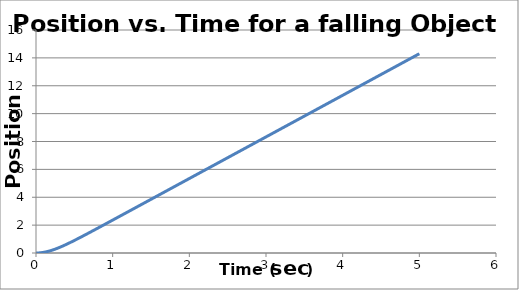
| Category | Series 0 |
|---|---|
| 0.0 | 0 |
| 0.005 | 0 |
| 0.01 | 0 |
| 0.015 | 0.001 |
| 0.02 | 0.002 |
| 0.025 | 0.003 |
| 0.030000000000000002 | 0.004 |
| 0.035 | 0.006 |
| 0.04 | 0.008 |
| 0.045 | 0.01 |
| 0.049999999999999996 | 0.012 |
| 0.05499999999999999 | 0.015 |
| 0.05999999999999999 | 0.018 |
| 0.06499999999999999 | 0.021 |
| 0.06999999999999999 | 0.024 |
| 0.075 | 0.027 |
| 0.08 | 0.031 |
| 0.085 | 0.035 |
| 0.09000000000000001 | 0.039 |
| 0.09500000000000001 | 0.044 |
| 0.10000000000000002 | 0.048 |
| 0.10500000000000002 | 0.053 |
| 0.11000000000000003 | 0.058 |
| 0.11500000000000003 | 0.063 |
| 0.12000000000000004 | 0.069 |
| 0.12500000000000003 | 0.075 |
| 0.13000000000000003 | 0.081 |
| 0.13500000000000004 | 0.087 |
| 0.14000000000000004 | 0.093 |
| 0.14500000000000005 | 0.1 |
| 0.15000000000000005 | 0.106 |
| 0.15500000000000005 | 0.113 |
| 0.16000000000000006 | 0.12 |
| 0.16500000000000006 | 0.128 |
| 0.17000000000000007 | 0.135 |
| 0.17500000000000007 | 0.143 |
| 0.18000000000000008 | 0.151 |
| 0.18500000000000008 | 0.159 |
| 0.19000000000000009 | 0.167 |
| 0.1950000000000001 | 0.175 |
| 0.2000000000000001 | 0.184 |
| 0.2050000000000001 | 0.193 |
| 0.2100000000000001 | 0.201 |
| 0.2150000000000001 | 0.21 |
| 0.2200000000000001 | 0.22 |
| 0.22500000000000012 | 0.229 |
| 0.23000000000000012 | 0.239 |
| 0.23500000000000013 | 0.248 |
| 0.24000000000000013 | 0.258 |
| 0.24500000000000013 | 0.268 |
| 0.2500000000000001 | 0.278 |
| 0.2550000000000001 | 0.288 |
| 0.2600000000000001 | 0.298 |
| 0.2650000000000001 | 0.309 |
| 0.27000000000000013 | 0.319 |
| 0.27500000000000013 | 0.33 |
| 0.28000000000000014 | 0.341 |
| 0.28500000000000014 | 0.352 |
| 0.29000000000000015 | 0.363 |
| 0.29500000000000015 | 0.374 |
| 0.30000000000000016 | 0.385 |
| 0.30500000000000016 | 0.397 |
| 0.31000000000000016 | 0.408 |
| 0.31500000000000017 | 0.42 |
| 0.3200000000000002 | 0.431 |
| 0.3250000000000002 | 0.443 |
| 0.3300000000000002 | 0.455 |
| 0.3350000000000002 | 0.467 |
| 0.3400000000000002 | 0.479 |
| 0.3450000000000002 | 0.491 |
| 0.3500000000000002 | 0.503 |
| 0.3550000000000002 | 0.516 |
| 0.3600000000000002 | 0.528 |
| 0.3650000000000002 | 0.54 |
| 0.3700000000000002 | 0.553 |
| 0.3750000000000002 | 0.566 |
| 0.3800000000000002 | 0.578 |
| 0.38500000000000023 | 0.591 |
| 0.39000000000000024 | 0.604 |
| 0.39500000000000024 | 0.617 |
| 0.40000000000000024 | 0.629 |
| 0.40500000000000025 | 0.642 |
| 0.41000000000000025 | 0.656 |
| 0.41500000000000026 | 0.669 |
| 0.42000000000000026 | 0.682 |
| 0.42500000000000027 | 0.695 |
| 0.43000000000000027 | 0.708 |
| 0.4350000000000003 | 0.722 |
| 0.4400000000000003 | 0.735 |
| 0.4450000000000003 | 0.748 |
| 0.4500000000000003 | 0.762 |
| 0.4550000000000003 | 0.775 |
| 0.4600000000000003 | 0.789 |
| 0.4650000000000003 | 0.802 |
| 0.4700000000000003 | 0.816 |
| 0.4750000000000003 | 0.83 |
| 0.4800000000000003 | 0.843 |
| 0.4850000000000003 | 0.857 |
| 0.4900000000000003 | 0.871 |
| 0.49500000000000033 | 0.885 |
| 0.5000000000000003 | 0.899 |
| 0.5050000000000003 | 0.913 |
| 0.5100000000000003 | 0.927 |
| 0.5150000000000003 | 0.941 |
| 0.5200000000000004 | 0.954 |
| 0.5250000000000004 | 0.969 |
| 0.5300000000000004 | 0.983 |
| 0.5350000000000004 | 0.997 |
| 0.5400000000000004 | 1.011 |
| 0.5450000000000004 | 1.025 |
| 0.5500000000000004 | 1.039 |
| 0.5550000000000004 | 1.053 |
| 0.5600000000000004 | 1.067 |
| 0.5650000000000004 | 1.082 |
| 0.5700000000000004 | 1.096 |
| 0.5750000000000004 | 1.11 |
| 0.5800000000000004 | 1.124 |
| 0.5850000000000004 | 1.139 |
| 0.5900000000000004 | 1.153 |
| 0.5950000000000004 | 1.167 |
| 0.6000000000000004 | 1.182 |
| 0.6050000000000004 | 1.196 |
| 0.6100000000000004 | 1.211 |
| 0.6150000000000004 | 1.225 |
| 0.6200000000000004 | 1.239 |
| 0.6250000000000004 | 1.254 |
| 0.6300000000000004 | 1.268 |
| 0.6350000000000005 | 1.283 |
| 0.6400000000000005 | 1.297 |
| 0.6450000000000005 | 1.312 |
| 0.6500000000000005 | 1.326 |
| 0.6550000000000005 | 1.341 |
| 0.6600000000000005 | 1.355 |
| 0.6650000000000005 | 1.37 |
| 0.6700000000000005 | 1.385 |
| 0.6750000000000005 | 1.399 |
| 0.6800000000000005 | 1.414 |
| 0.6850000000000005 | 1.428 |
| 0.6900000000000005 | 1.443 |
| 0.6950000000000005 | 1.458 |
| 0.7000000000000005 | 1.472 |
| 0.7050000000000005 | 1.487 |
| 0.7100000000000005 | 1.502 |
| 0.7150000000000005 | 1.516 |
| 0.7200000000000005 | 1.531 |
| 0.7250000000000005 | 1.546 |
| 0.7300000000000005 | 1.56 |
| 0.7350000000000005 | 1.575 |
| 0.7400000000000005 | 1.59 |
| 0.7450000000000006 | 1.604 |
| 0.7500000000000006 | 1.619 |
| 0.7550000000000006 | 1.634 |
| 0.7600000000000006 | 1.649 |
| 0.7650000000000006 | 1.663 |
| 0.7700000000000006 | 1.678 |
| 0.7750000000000006 | 1.693 |
| 0.7800000000000006 | 1.708 |
| 0.7850000000000006 | 1.722 |
| 0.7900000000000006 | 1.737 |
| 0.7950000000000006 | 1.752 |
| 0.8000000000000006 | 1.767 |
| 0.8050000000000006 | 1.781 |
| 0.8100000000000006 | 1.796 |
| 0.8150000000000006 | 1.811 |
| 0.8200000000000006 | 1.826 |
| 0.8250000000000006 | 1.841 |
| 0.8300000000000006 | 1.855 |
| 0.8350000000000006 | 1.87 |
| 0.8400000000000006 | 1.885 |
| 0.8450000000000006 | 1.9 |
| 0.8500000000000006 | 1.915 |
| 0.8550000000000006 | 1.929 |
| 0.8600000000000007 | 1.944 |
| 0.8650000000000007 | 1.959 |
| 0.8700000000000007 | 1.974 |
| 0.8750000000000007 | 1.989 |
| 0.8800000000000007 | 2.004 |
| 0.8850000000000007 | 2.018 |
| 0.8900000000000007 | 2.033 |
| 0.8950000000000007 | 2.048 |
| 0.9000000000000007 | 2.063 |
| 0.9050000000000007 | 2.078 |
| 0.9100000000000007 | 2.093 |
| 0.9150000000000007 | 2.108 |
| 0.9200000000000007 | 2.122 |
| 0.9250000000000007 | 2.137 |
| 0.9300000000000007 | 2.152 |
| 0.9350000000000007 | 2.167 |
| 0.9400000000000007 | 2.182 |
| 0.9450000000000007 | 2.197 |
| 0.9500000000000007 | 2.212 |
| 0.9550000000000007 | 2.226 |
| 0.9600000000000007 | 2.241 |
| 0.9650000000000007 | 2.256 |
| 0.9700000000000008 | 2.271 |
| 0.9750000000000008 | 2.286 |
| 0.9800000000000008 | 2.301 |
| 0.9850000000000008 | 2.316 |
| 0.9900000000000008 | 2.331 |
| 0.9950000000000008 | 2.345 |
| 1.0000000000000007 | 2.36 |
| 1.0050000000000006 | 2.375 |
| 1.0100000000000005 | 2.39 |
| 1.0150000000000003 | 2.405 |
| 1.0200000000000002 | 2.42 |
| 1.0250000000000001 | 2.435 |
| 1.03 | 2.45 |
| 1.035 | 2.465 |
| 1.0399999999999998 | 2.48 |
| 1.0449999999999997 | 2.494 |
| 1.0499999999999996 | 2.509 |
| 1.0549999999999995 | 2.524 |
| 1.0599999999999994 | 2.539 |
| 1.0649999999999993 | 2.554 |
| 1.0699999999999992 | 2.569 |
| 1.074999999999999 | 2.584 |
| 1.079999999999999 | 2.599 |
| 1.0849999999999989 | 2.614 |
| 1.0899999999999987 | 2.628 |
| 1.0949999999999986 | 2.643 |
| 1.0999999999999985 | 2.658 |
| 1.1049999999999984 | 2.673 |
| 1.1099999999999983 | 2.688 |
| 1.1149999999999982 | 2.703 |
| 1.119999999999998 | 2.718 |
| 1.124999999999998 | 2.733 |
| 1.129999999999998 | 2.748 |
| 1.1349999999999978 | 2.763 |
| 1.1399999999999977 | 2.778 |
| 1.1449999999999976 | 2.792 |
| 1.1499999999999975 | 2.807 |
| 1.1549999999999974 | 2.822 |
| 1.1599999999999973 | 2.837 |
| 1.1649999999999971 | 2.852 |
| 1.169999999999997 | 2.867 |
| 1.174999999999997 | 2.882 |
| 1.1799999999999968 | 2.897 |
| 1.1849999999999967 | 2.912 |
| 1.1899999999999966 | 2.927 |
| 1.1949999999999965 | 2.942 |
| 1.1999999999999964 | 2.956 |
| 1.2049999999999963 | 2.971 |
| 1.2099999999999962 | 2.986 |
| 1.214999999999996 | 3.001 |
| 1.219999999999996 | 3.016 |
| 1.2249999999999959 | 3.031 |
| 1.2299999999999958 | 3.046 |
| 1.2349999999999957 | 3.061 |
| 1.2399999999999956 | 3.076 |
| 1.2449999999999954 | 3.091 |
| 1.2499999999999953 | 3.106 |
| 1.2549999999999952 | 3.121 |
| 1.2599999999999951 | 3.135 |
| 1.264999999999995 | 3.15 |
| 1.269999999999995 | 3.165 |
| 1.2749999999999948 | 3.18 |
| 1.2799999999999947 | 3.195 |
| 1.2849999999999946 | 3.21 |
| 1.2899999999999945 | 3.225 |
| 1.2949999999999944 | 3.24 |
| 1.2999999999999943 | 3.255 |
| 1.3049999999999942 | 3.27 |
| 1.309999999999994 | 3.285 |
| 1.314999999999994 | 3.3 |
| 1.3199999999999938 | 3.315 |
| 1.3249999999999937 | 3.329 |
| 1.3299999999999936 | 3.344 |
| 1.3349999999999935 | 3.359 |
| 1.3399999999999934 | 3.374 |
| 1.3449999999999933 | 3.389 |
| 1.3499999999999932 | 3.404 |
| 1.354999999999993 | 3.419 |
| 1.359999999999993 | 3.434 |
| 1.3649999999999929 | 3.449 |
| 1.3699999999999928 | 3.464 |
| 1.3749999999999927 | 3.479 |
| 1.3799999999999926 | 3.494 |
| 1.3849999999999925 | 3.508 |
| 1.3899999999999924 | 3.523 |
| 1.3949999999999922 | 3.538 |
| 1.3999999999999921 | 3.553 |
| 1.404999999999992 | 3.568 |
| 1.409999999999992 | 3.583 |
| 1.4149999999999918 | 3.598 |
| 1.4199999999999917 | 3.613 |
| 1.4249999999999916 | 3.628 |
| 1.4299999999999915 | 3.643 |
| 1.4349999999999914 | 3.658 |
| 1.4399999999999913 | 3.673 |
| 1.4449999999999912 | 3.688 |
| 1.449999999999991 | 3.702 |
| 1.454999999999991 | 3.717 |
| 1.4599999999999909 | 3.732 |
| 1.4649999999999908 | 3.747 |
| 1.4699999999999906 | 3.762 |
| 1.4749999999999905 | 3.777 |
| 1.4799999999999904 | 3.792 |
| 1.4849999999999903 | 3.807 |
| 1.4899999999999902 | 3.822 |
| 1.4949999999999901 | 3.837 |
| 1.49999999999999 | 3.852 |
| 1.50499999999999 | 3.867 |
| 1.5099999999999898 | 3.882 |
| 1.5149999999999897 | 3.896 |
| 1.5199999999999896 | 3.911 |
| 1.5249999999999895 | 3.926 |
| 1.5299999999999894 | 3.941 |
| 1.5349999999999893 | 3.956 |
| 1.5399999999999892 | 3.971 |
| 1.544999999999989 | 3.986 |
| 1.549999999999989 | 4.001 |
| 1.5549999999999888 | 4.016 |
| 1.5599999999999887 | 4.031 |
| 1.5649999999999886 | 4.046 |
| 1.5699999999999885 | 4.061 |
| 1.5749999999999884 | 4.076 |
| 1.5799999999999883 | 4.09 |
| 1.5849999999999882 | 4.105 |
| 1.589999999999988 | 4.12 |
| 1.594999999999988 | 4.135 |
| 1.5999999999999879 | 4.15 |
| 1.6049999999999878 | 4.165 |
| 1.6099999999999877 | 4.18 |
| 1.6149999999999876 | 4.195 |
| 1.6199999999999875 | 4.21 |
| 1.6249999999999873 | 4.225 |
| 1.6299999999999872 | 4.24 |
| 1.6349999999999871 | 4.255 |
| 1.639999999999987 | 4.27 |
| 1.644999999999987 | 4.284 |
| 1.6499999999999868 | 4.299 |
| 1.6549999999999867 | 4.314 |
| 1.6599999999999866 | 4.329 |
| 1.6649999999999865 | 4.344 |
| 1.6699999999999864 | 4.359 |
| 1.6749999999999863 | 4.374 |
| 1.6799999999999862 | 4.389 |
| 1.684999999999986 | 4.404 |
| 1.689999999999986 | 4.419 |
| 1.6949999999999859 | 4.434 |
| 1.6999999999999857 | 4.449 |
| 1.7049999999999856 | 4.464 |
| 1.7099999999999855 | 4.478 |
| 1.7149999999999854 | 4.493 |
| 1.7199999999999853 | 4.508 |
| 1.7249999999999852 | 4.523 |
| 1.729999999999985 | 4.538 |
| 1.734999999999985 | 4.553 |
| 1.739999999999985 | 4.568 |
| 1.7449999999999848 | 4.583 |
| 1.7499999999999847 | 4.598 |
| 1.7549999999999846 | 4.613 |
| 1.7599999999999845 | 4.628 |
| 1.7649999999999844 | 4.643 |
| 1.7699999999999843 | 4.658 |
| 1.7749999999999841 | 4.672 |
| 1.779999999999984 | 4.687 |
| 1.784999999999984 | 4.702 |
| 1.7899999999999838 | 4.717 |
| 1.7949999999999837 | 4.732 |
| 1.7999999999999836 | 4.747 |
| 1.8049999999999835 | 4.762 |
| 1.8099999999999834 | 4.777 |
| 1.8149999999999833 | 4.792 |
| 1.8199999999999832 | 4.807 |
| 1.824999999999983 | 4.822 |
| 1.829999999999983 | 4.837 |
| 1.8349999999999829 | 4.852 |
| 1.8399999999999828 | 4.866 |
| 1.8449999999999827 | 4.881 |
| 1.8499999999999825 | 4.896 |
| 1.8549999999999824 | 4.911 |
| 1.8599999999999823 | 4.926 |
| 1.8649999999999822 | 4.941 |
| 1.8699999999999821 | 4.956 |
| 1.874999999999982 | 4.971 |
| 1.879999999999982 | 4.986 |
| 1.8849999999999818 | 5.001 |
| 1.8899999999999817 | 5.016 |
| 1.8949999999999816 | 5.031 |
| 1.8999999999999815 | 5.046 |
| 1.9049999999999814 | 5.06 |
| 1.9099999999999813 | 5.075 |
| 1.9149999999999812 | 5.09 |
| 1.919999999999981 | 5.105 |
| 1.924999999999981 | 5.12 |
| 1.9299999999999808 | 5.135 |
| 1.9349999999999807 | 5.15 |
| 1.9399999999999806 | 5.165 |
| 1.9449999999999805 | 5.18 |
| 1.9499999999999804 | 5.195 |
| 1.9549999999999803 | 5.21 |
| 1.9599999999999802 | 5.225 |
| 1.96499999999998 | 5.24 |
| 1.96999999999998 | 5.254 |
| 1.9749999999999799 | 5.269 |
| 1.9799999999999798 | 5.284 |
| 1.9849999999999797 | 5.299 |
| 1.9899999999999796 | 5.314 |
| 1.9949999999999795 | 5.329 |
| 1.9999999999999793 | 5.344 |
| 2.0049999999999795 | 5.359 |
| 2.0099999999999794 | 5.374 |
| 2.0149999999999793 | 5.389 |
| 2.019999999999979 | 5.404 |
| 2.024999999999979 | 5.419 |
| 2.029999999999979 | 5.434 |
| 2.034999999999979 | 5.449 |
| 2.0399999999999787 | 5.463 |
| 2.0449999999999786 | 5.478 |
| 2.0499999999999785 | 5.493 |
| 2.0549999999999784 | 5.508 |
| 2.0599999999999783 | 5.523 |
| 2.064999999999978 | 5.538 |
| 2.069999999999978 | 5.553 |
| 2.074999999999978 | 5.568 |
| 2.079999999999978 | 5.583 |
| 2.0849999999999778 | 5.598 |
| 2.0899999999999777 | 5.613 |
| 2.0949999999999775 | 5.628 |
| 2.0999999999999774 | 5.643 |
| 2.1049999999999773 | 5.657 |
| 2.1099999999999772 | 5.672 |
| 2.114999999999977 | 5.687 |
| 2.119999999999977 | 5.702 |
| 2.124999999999977 | 5.717 |
| 2.129999999999977 | 5.732 |
| 2.1349999999999767 | 5.747 |
| 2.1399999999999766 | 5.762 |
| 2.1449999999999765 | 5.777 |
| 2.1499999999999764 | 5.792 |
| 2.1549999999999763 | 5.807 |
| 2.159999999999976 | 5.822 |
| 2.164999999999976 | 5.837 |
| 2.169999999999976 | 5.851 |
| 2.174999999999976 | 5.866 |
| 2.1799999999999757 | 5.881 |
| 2.1849999999999756 | 5.896 |
| 2.1899999999999755 | 5.911 |
| 2.1949999999999754 | 5.926 |
| 2.1999999999999753 | 5.941 |
| 2.204999999999975 | 5.956 |
| 2.209999999999975 | 5.971 |
| 2.214999999999975 | 5.986 |
| 2.219999999999975 | 6.001 |
| 2.2249999999999748 | 6.016 |
| 2.2299999999999747 | 6.031 |
| 2.2349999999999746 | 6.045 |
| 2.2399999999999745 | 6.06 |
| 2.2449999999999743 | 6.075 |
| 2.2499999999999742 | 6.09 |
| 2.254999999999974 | 6.105 |
| 2.259999999999974 | 6.12 |
| 2.264999999999974 | 6.135 |
| 2.269999999999974 | 6.15 |
| 2.2749999999999737 | 6.165 |
| 2.2799999999999736 | 6.18 |
| 2.2849999999999735 | 6.195 |
| 2.2899999999999734 | 6.21 |
| 2.2949999999999733 | 6.225 |
| 2.299999999999973 | 6.239 |
| 2.304999999999973 | 6.254 |
| 2.309999999999973 | 6.269 |
| 2.314999999999973 | 6.284 |
| 2.3199999999999728 | 6.299 |
| 2.3249999999999726 | 6.314 |
| 2.3299999999999725 | 6.329 |
| 2.3349999999999724 | 6.344 |
| 2.3399999999999723 | 6.359 |
| 2.344999999999972 | 6.374 |
| 2.349999999999972 | 6.389 |
| 2.354999999999972 | 6.404 |
| 2.359999999999972 | 6.419 |
| 2.364999999999972 | 6.433 |
| 2.3699999999999717 | 6.448 |
| 2.3749999999999716 | 6.463 |
| 2.3799999999999715 | 6.478 |
| 2.3849999999999714 | 6.493 |
| 2.3899999999999713 | 6.508 |
| 2.394999999999971 | 6.523 |
| 2.399999999999971 | 6.538 |
| 2.404999999999971 | 6.553 |
| 2.409999999999971 | 6.568 |
| 2.4149999999999707 | 6.583 |
| 2.4199999999999706 | 6.598 |
| 2.4249999999999705 | 6.613 |
| 2.4299999999999704 | 6.628 |
| 2.4349999999999703 | 6.642 |
| 2.43999999999997 | 6.657 |
| 2.44499999999997 | 6.672 |
| 2.44999999999997 | 6.687 |
| 2.45499999999997 | 6.702 |
| 2.4599999999999698 | 6.717 |
| 2.4649999999999697 | 6.732 |
| 2.4699999999999696 | 6.747 |
| 2.4749999999999694 | 6.762 |
| 2.4799999999999693 | 6.777 |
| 2.4849999999999692 | 6.792 |
| 2.489999999999969 | 6.807 |
| 2.494999999999969 | 6.822 |
| 2.499999999999969 | 6.836 |
| 2.504999999999969 | 6.851 |
| 2.5099999999999687 | 6.866 |
| 2.5149999999999686 | 6.881 |
| 2.5199999999999685 | 6.896 |
| 2.5249999999999684 | 6.911 |
| 2.5299999999999683 | 6.926 |
| 2.534999999999968 | 6.941 |
| 2.539999999999968 | 6.956 |
| 2.544999999999968 | 6.971 |
| 2.549999999999968 | 6.986 |
| 2.5549999999999677 | 7.001 |
| 2.5599999999999676 | 7.016 |
| 2.5649999999999675 | 7.03 |
| 2.5699999999999674 | 7.045 |
| 2.5749999999999673 | 7.06 |
| 2.579999999999967 | 7.075 |
| 2.584999999999967 | 7.09 |
| 2.589999999999967 | 7.105 |
| 2.594999999999967 | 7.12 |
| 2.599999999999967 | 7.135 |
| 2.6049999999999667 | 7.15 |
| 2.6099999999999666 | 7.165 |
| 2.6149999999999665 | 7.18 |
| 2.6199999999999664 | 7.195 |
| 2.6249999999999662 | 7.21 |
| 2.629999999999966 | 7.224 |
| 2.634999999999966 | 7.239 |
| 2.639999999999966 | 7.254 |
| 2.644999999999966 | 7.269 |
| 2.6499999999999657 | 7.284 |
| 2.6549999999999656 | 7.299 |
| 2.6599999999999655 | 7.314 |
| 2.6649999999999654 | 7.329 |
| 2.6699999999999653 | 7.344 |
| 2.674999999999965 | 7.359 |
| 2.679999999999965 | 7.374 |
| 2.684999999999965 | 7.389 |
| 2.689999999999965 | 7.404 |
| 2.6949999999999648 | 7.418 |
| 2.6999999999999647 | 7.433 |
| 2.7049999999999645 | 7.448 |
| 2.7099999999999644 | 7.463 |
| 2.7149999999999643 | 7.478 |
| 2.7199999999999642 | 7.493 |
| 2.724999999999964 | 7.508 |
| 2.729999999999964 | 7.523 |
| 2.734999999999964 | 7.538 |
| 2.739999999999964 | 7.553 |
| 2.7449999999999637 | 7.568 |
| 2.7499999999999636 | 7.583 |
| 2.7549999999999635 | 7.598 |
| 2.7599999999999634 | 7.612 |
| 2.7649999999999633 | 7.627 |
| 2.769999999999963 | 7.642 |
| 2.774999999999963 | 7.657 |
| 2.779999999999963 | 7.672 |
| 2.784999999999963 | 7.687 |
| 2.7899999999999627 | 7.702 |
| 2.7949999999999626 | 7.717 |
| 2.7999999999999625 | 7.732 |
| 2.8049999999999624 | 7.747 |
| 2.8099999999999623 | 7.762 |
| 2.814999999999962 | 7.777 |
| 2.819999999999962 | 7.792 |
| 2.824999999999962 | 7.807 |
| 2.829999999999962 | 7.821 |
| 2.8349999999999618 | 7.836 |
| 2.8399999999999617 | 7.851 |
| 2.8449999999999616 | 7.866 |
| 2.8499999999999615 | 7.881 |
| 2.8549999999999613 | 7.896 |
| 2.8599999999999612 | 7.911 |
| 2.864999999999961 | 7.926 |
| 2.869999999999961 | 7.941 |
| 2.874999999999961 | 7.956 |
| 2.879999999999961 | 7.971 |
| 2.8849999999999607 | 7.986 |
| 2.8899999999999606 | 8.001 |
| 2.8949999999999605 | 8.015 |
| 2.8999999999999604 | 8.03 |
| 2.9049999999999603 | 8.045 |
| 2.90999999999996 | 8.06 |
| 2.91499999999996 | 8.075 |
| 2.91999999999996 | 8.09 |
| 2.92499999999996 | 8.105 |
| 2.9299999999999597 | 8.12 |
| 2.9349999999999596 | 8.135 |
| 2.9399999999999595 | 8.15 |
| 2.9449999999999594 | 8.165 |
| 2.9499999999999593 | 8.18 |
| 2.954999999999959 | 8.195 |
| 2.959999999999959 | 8.209 |
| 2.964999999999959 | 8.224 |
| 2.969999999999959 | 8.239 |
| 2.974999999999959 | 8.254 |
| 2.9799999999999587 | 8.269 |
| 2.9849999999999586 | 8.284 |
| 2.9899999999999585 | 8.299 |
| 2.9949999999999584 | 8.314 |
| 2.9999999999999583 | 8.329 |
| 3.004999999999958 | 8.344 |
| 3.009999999999958 | 8.359 |
| 3.014999999999958 | 8.374 |
| 3.019999999999958 | 8.389 |
| 3.0249999999999577 | 8.403 |
| 3.0299999999999576 | 8.418 |
| 3.0349999999999575 | 8.433 |
| 3.0399999999999574 | 8.448 |
| 3.0449999999999573 | 8.463 |
| 3.049999999999957 | 8.478 |
| 3.054999999999957 | 8.493 |
| 3.059999999999957 | 8.508 |
| 3.064999999999957 | 8.523 |
| 3.0699999999999568 | 8.538 |
| 3.0749999999999567 | 8.553 |
| 3.0799999999999566 | 8.568 |
| 3.0849999999999564 | 8.583 |
| 3.0899999999999563 | 8.597 |
| 3.0949999999999562 | 8.612 |
| 3.099999999999956 | 8.627 |
| 3.104999999999956 | 8.642 |
| 3.109999999999956 | 8.657 |
| 3.114999999999956 | 8.672 |
| 3.1199999999999557 | 8.687 |
| 3.1249999999999556 | 8.702 |
| 3.1299999999999555 | 8.717 |
| 3.1349999999999554 | 8.732 |
| 3.1399999999999553 | 8.747 |
| 3.144999999999955 | 8.762 |
| 3.149999999999955 | 8.777 |
| 3.154999999999955 | 8.791 |
| 3.159999999999955 | 8.806 |
| 3.1649999999999547 | 8.821 |
| 3.1699999999999546 | 8.836 |
| 3.1749999999999545 | 8.851 |
| 3.1799999999999544 | 8.866 |
| 3.1849999999999543 | 8.881 |
| 3.189999999999954 | 8.896 |
| 3.194999999999954 | 8.911 |
| 3.199999999999954 | 8.926 |
| 3.204999999999954 | 8.941 |
| 3.209999999999954 | 8.956 |
| 3.2149999999999537 | 8.971 |
| 3.2199999999999536 | 8.986 |
| 3.2249999999999535 | 9 |
| 3.2299999999999534 | 9.015 |
| 3.2349999999999532 | 9.03 |
| 3.239999999999953 | 9.045 |
| 3.244999999999953 | 9.06 |
| 3.249999999999953 | 9.075 |
| 3.254999999999953 | 9.09 |
| 3.2599999999999527 | 9.105 |
| 3.2649999999999526 | 9.12 |
| 3.2699999999999525 | 9.135 |
| 3.2749999999999524 | 9.15 |
| 3.2799999999999523 | 9.165 |
| 3.284999999999952 | 9.18 |
| 3.289999999999952 | 9.194 |
| 3.294999999999952 | 9.209 |
| 3.299999999999952 | 9.224 |
| 3.3049999999999518 | 9.239 |
| 3.3099999999999516 | 9.254 |
| 3.3149999999999515 | 9.269 |
| 3.3199999999999514 | 9.284 |
| 3.3249999999999513 | 9.299 |
| 3.329999999999951 | 9.314 |
| 3.334999999999951 | 9.329 |
| 3.339999999999951 | 9.344 |
| 3.344999999999951 | 9.359 |
| 3.349999999999951 | 9.374 |
| 3.3549999999999507 | 9.388 |
| 3.3599999999999506 | 9.403 |
| 3.3649999999999505 | 9.418 |
| 3.3699999999999504 | 9.433 |
| 3.3749999999999503 | 9.448 |
| 3.37999999999995 | 9.463 |
| 3.38499999999995 | 9.478 |
| 3.38999999999995 | 9.493 |
| 3.39499999999995 | 9.508 |
| 3.3999999999999497 | 9.523 |
| 3.4049999999999496 | 9.538 |
| 3.4099999999999495 | 9.553 |
| 3.4149999999999494 | 9.568 |
| 3.4199999999999493 | 9.582 |
| 3.424999999999949 | 9.597 |
| 3.429999999999949 | 9.612 |
| 3.434999999999949 | 9.627 |
| 3.439999999999949 | 9.642 |
| 3.4449999999999488 | 9.657 |
| 3.4499999999999487 | 9.672 |
| 3.4549999999999486 | 9.687 |
| 3.4599999999999485 | 9.702 |
| 3.4649999999999483 | 9.717 |
| 3.4699999999999482 | 9.732 |
| 3.474999999999948 | 9.747 |
| 3.479999999999948 | 9.762 |
| 3.484999999999948 | 9.776 |
| 3.489999999999948 | 9.791 |
| 3.4949999999999477 | 9.806 |
| 3.4999999999999476 | 9.821 |
| 3.5049999999999475 | 9.836 |
| 3.5099999999999474 | 9.851 |
| 3.5149999999999473 | 9.866 |
| 3.519999999999947 | 9.881 |
| 3.524999999999947 | 9.896 |
| 3.529999999999947 | 9.911 |
| 3.534999999999947 | 9.926 |
| 3.5399999999999467 | 9.941 |
| 3.5449999999999466 | 9.956 |
| 3.5499999999999465 | 9.97 |
| 3.5549999999999464 | 9.985 |
| 3.5599999999999463 | 10 |
| 3.564999999999946 | 10.015 |
| 3.569999999999946 | 10.03 |
| 3.574999999999946 | 10.045 |
| 3.579999999999946 | 10.06 |
| 3.584999999999946 | 10.075 |
| 3.5899999999999457 | 10.09 |
| 3.5949999999999456 | 10.105 |
| 3.5999999999999455 | 10.12 |
| 3.6049999999999454 | 10.135 |
| 3.6099999999999453 | 10.15 |
| 3.614999999999945 | 10.165 |
| 3.619999999999945 | 10.179 |
| 3.624999999999945 | 10.194 |
| 3.629999999999945 | 10.209 |
| 3.6349999999999447 | 10.224 |
| 3.6399999999999446 | 10.239 |
| 3.6449999999999445 | 10.254 |
| 3.6499999999999444 | 10.269 |
| 3.6549999999999443 | 10.284 |
| 3.659999999999944 | 10.299 |
| 3.664999999999944 | 10.314 |
| 3.669999999999944 | 10.329 |
| 3.674999999999944 | 10.344 |
| 3.6799999999999438 | 10.359 |
| 3.6849999999999437 | 10.373 |
| 3.6899999999999435 | 10.388 |
| 3.6949999999999434 | 10.403 |
| 3.6999999999999433 | 10.418 |
| 3.7049999999999432 | 10.433 |
| 3.709999999999943 | 10.448 |
| 3.714999999999943 | 10.463 |
| 3.719999999999943 | 10.478 |
| 3.724999999999943 | 10.493 |
| 3.7299999999999427 | 10.508 |
| 3.7349999999999426 | 10.523 |
| 3.7399999999999425 | 10.538 |
| 3.7449999999999424 | 10.553 |
| 3.7499999999999423 | 10.567 |
| 3.754999999999942 | 10.582 |
| 3.759999999999942 | 10.597 |
| 3.764999999999942 | 10.612 |
| 3.769999999999942 | 10.627 |
| 3.7749999999999417 | 10.642 |
| 3.7799999999999416 | 10.657 |
| 3.7849999999999415 | 10.672 |
| 3.7899999999999414 | 10.687 |
| 3.7949999999999413 | 10.702 |
| 3.799999999999941 | 10.717 |
| 3.804999999999941 | 10.732 |
| 3.809999999999941 | 10.747 |
| 3.814999999999941 | 10.761 |
| 3.8199999999999408 | 10.776 |
| 3.8249999999999407 | 10.791 |
| 3.8299999999999406 | 10.806 |
| 3.8349999999999405 | 10.821 |
| 3.8399999999999403 | 10.836 |
| 3.8449999999999402 | 10.851 |
| 3.84999999999994 | 10.866 |
| 3.85499999999994 | 10.881 |
| 3.85999999999994 | 10.896 |
| 3.86499999999994 | 10.911 |
| 3.8699999999999397 | 10.926 |
| 3.8749999999999396 | 10.941 |
| 3.8799999999999395 | 10.955 |
| 3.8849999999999394 | 10.97 |
| 3.8899999999999393 | 10.985 |
| 3.894999999999939 | 11 |
| 3.899999999999939 | 11.015 |
| 3.904999999999939 | 11.03 |
| 3.909999999999939 | 11.045 |
| 3.9149999999999388 | 11.06 |
| 3.9199999999999386 | 11.075 |
| 3.9249999999999385 | 11.09 |
| 3.9299999999999384 | 11.105 |
| 3.9349999999999383 | 11.12 |
| 3.939999999999938 | 11.135 |
| 3.944999999999938 | 11.149 |
| 3.949999999999938 | 11.164 |
| 3.954999999999938 | 11.179 |
| 3.959999999999938 | 11.194 |
| 3.9649999999999377 | 11.209 |
| 3.9699999999999376 | 11.224 |
| 3.9749999999999375 | 11.239 |
| 3.9799999999999374 | 11.254 |
| 3.9849999999999373 | 11.269 |
| 3.989999999999937 | 11.284 |
| 3.994999999999937 | 11.299 |
| 3.999999999999937 | 11.314 |
| 4.004999999999937 | 11.329 |
| 4.009999999999937 | 11.344 |
| 4.014999999999937 | 11.358 |
| 4.0199999999999365 | 11.373 |
| 4.024999999999936 | 11.388 |
| 4.029999999999936 | 11.403 |
| 4.034999999999936 | 11.418 |
| 4.039999999999936 | 11.433 |
| 4.044999999999936 | 11.448 |
| 4.049999999999936 | 11.463 |
| 4.054999999999936 | 11.478 |
| 4.059999999999936 | 11.493 |
| 4.0649999999999356 | 11.508 |
| 4.0699999999999354 | 11.523 |
| 4.074999999999935 | 11.538 |
| 4.079999999999935 | 11.552 |
| 4.084999999999935 | 11.567 |
| 4.089999999999935 | 11.582 |
| 4.094999999999935 | 11.597 |
| 4.099999999999935 | 11.612 |
| 4.104999999999935 | 11.627 |
| 4.109999999999935 | 11.642 |
| 4.1149999999999345 | 11.657 |
| 4.119999999999934 | 11.672 |
| 4.124999999999934 | 11.687 |
| 4.129999999999934 | 11.702 |
| 4.134999999999934 | 11.717 |
| 4.139999999999934 | 11.732 |
| 4.144999999999934 | 11.746 |
| 4.149999999999934 | 11.761 |
| 4.154999999999934 | 11.776 |
| 4.1599999999999335 | 11.791 |
| 4.164999999999933 | 11.806 |
| 4.169999999999933 | 11.821 |
| 4.174999999999933 | 11.836 |
| 4.179999999999933 | 11.851 |
| 4.184999999999933 | 11.866 |
| 4.189999999999933 | 11.881 |
| 4.194999999999933 | 11.896 |
| 4.199999999999933 | 11.911 |
| 4.204999999999933 | 11.926 |
| 4.2099999999999325 | 11.94 |
| 4.214999999999932 | 11.955 |
| 4.219999999999932 | 11.97 |
| 4.224999999999932 | 11.985 |
| 4.229999999999932 | 12 |
| 4.234999999999932 | 12.015 |
| 4.239999999999932 | 12.03 |
| 4.244999999999932 | 12.045 |
| 4.249999999999932 | 12.06 |
| 4.2549999999999315 | 12.075 |
| 4.259999999999931 | 12.09 |
| 4.264999999999931 | 12.105 |
| 4.269999999999931 | 12.12 |
| 4.274999999999931 | 12.134 |
| 4.279999999999931 | 12.149 |
| 4.284999999999931 | 12.164 |
| 4.289999999999931 | 12.179 |
| 4.294999999999931 | 12.194 |
| 4.2999999999999305 | 12.209 |
| 4.30499999999993 | 12.224 |
| 4.30999999999993 | 12.239 |
| 4.31499999999993 | 12.254 |
| 4.31999999999993 | 12.269 |
| 4.32499999999993 | 12.284 |
| 4.32999999999993 | 12.299 |
| 4.33499999999993 | 12.314 |
| 4.33999999999993 | 12.328 |
| 4.34499999999993 | 12.343 |
| 4.3499999999999295 | 12.358 |
| 4.354999999999929 | 12.373 |
| 4.359999999999929 | 12.388 |
| 4.364999999999929 | 12.403 |
| 4.369999999999929 | 12.418 |
| 4.374999999999929 | 12.433 |
| 4.379999999999929 | 12.448 |
| 4.384999999999929 | 12.463 |
| 4.389999999999929 | 12.478 |
| 4.3949999999999285 | 12.493 |
| 4.399999999999928 | 12.508 |
| 4.404999999999928 | 12.523 |
| 4.409999999999928 | 12.537 |
| 4.414999999999928 | 12.552 |
| 4.419999999999928 | 12.567 |
| 4.424999999999928 | 12.582 |
| 4.429999999999928 | 12.597 |
| 4.434999999999928 | 12.612 |
| 4.439999999999928 | 12.627 |
| 4.4449999999999275 | 12.642 |
| 4.449999999999927 | 12.657 |
| 4.454999999999927 | 12.672 |
| 4.459999999999927 | 12.687 |
| 4.464999999999927 | 12.702 |
| 4.469999999999927 | 12.717 |
| 4.474999999999927 | 12.731 |
| 4.479999999999927 | 12.746 |
| 4.484999999999927 | 12.761 |
| 4.4899999999999265 | 12.776 |
| 4.494999999999926 | 12.791 |
| 4.499999999999926 | 12.806 |
| 4.504999999999926 | 12.821 |
| 4.509999999999926 | 12.836 |
| 4.514999999999926 | 12.851 |
| 4.519999999999926 | 12.866 |
| 4.524999999999926 | 12.881 |
| 4.529999999999926 | 12.896 |
| 4.5349999999999255 | 12.911 |
| 4.539999999999925 | 12.925 |
| 4.544999999999925 | 12.94 |
| 4.549999999999925 | 12.955 |
| 4.554999999999925 | 12.97 |
| 4.559999999999925 | 12.985 |
| 4.564999999999925 | 13 |
| 4.569999999999925 | 13.015 |
| 4.574999999999925 | 13.03 |
| 4.579999999999925 | 13.045 |
| 4.5849999999999245 | 13.06 |
| 4.589999999999924 | 13.075 |
| 4.594999999999924 | 13.09 |
| 4.599999999999924 | 13.105 |
| 4.604999999999924 | 13.119 |
| 4.609999999999924 | 13.134 |
| 4.614999999999924 | 13.149 |
| 4.619999999999924 | 13.164 |
| 4.624999999999924 | 13.179 |
| 4.6299999999999235 | 13.194 |
| 4.634999999999923 | 13.209 |
| 4.639999999999923 | 13.224 |
| 4.644999999999923 | 13.239 |
| 4.649999999999923 | 13.254 |
| 4.654999999999923 | 13.269 |
| 4.659999999999923 | 13.284 |
| 4.664999999999923 | 13.299 |
| 4.669999999999923 | 13.313 |
| 4.6749999999999226 | 13.328 |
| 4.6799999999999224 | 13.343 |
| 4.684999999999922 | 13.358 |
| 4.689999999999922 | 13.373 |
| 4.694999999999922 | 13.388 |
| 4.699999999999922 | 13.403 |
| 4.704999999999922 | 13.418 |
| 4.709999999999922 | 13.433 |
| 4.714999999999922 | 13.448 |
| 4.719999999999922 | 13.463 |
| 4.7249999999999215 | 13.478 |
| 4.729999999999921 | 13.493 |
| 4.734999999999921 | 13.507 |
| 4.739999999999921 | 13.522 |
| 4.744999999999921 | 13.537 |
| 4.749999999999921 | 13.552 |
| 4.754999999999921 | 13.567 |
| 4.759999999999921 | 13.582 |
| 4.764999999999921 | 13.597 |
| 4.7699999999999205 | 13.612 |
| 4.77499999999992 | 13.627 |
| 4.77999999999992 | 13.642 |
| 4.78499999999992 | 13.657 |
| 4.78999999999992 | 13.672 |
| 4.79499999999992 | 13.687 |
| 4.79999999999992 | 13.702 |
| 4.80499999999992 | 13.716 |
| 4.80999999999992 | 13.731 |
| 4.81499999999992 | 13.746 |
| 4.8199999999999195 | 13.761 |
| 4.824999999999919 | 13.776 |
| 4.829999999999919 | 13.791 |
| 4.834999999999919 | 13.806 |
| 4.839999999999919 | 13.821 |
| 4.844999999999919 | 13.836 |
| 4.849999999999919 | 13.851 |
| 4.854999999999919 | 13.866 |
| 4.859999999999919 | 13.881 |
| 4.8649999999999185 | 13.896 |
| 4.869999999999918 | 13.91 |
| 4.874999999999918 | 13.925 |
| 4.879999999999918 | 13.94 |
| 4.884999999999918 | 13.955 |
| 4.889999999999918 | 13.97 |
| 4.894999999999918 | 13.985 |
| 4.899999999999918 | 14 |
| 4.904999999999918 | 14.015 |
| 4.9099999999999175 | 14.03 |
| 4.914999999999917 | 14.045 |
| 4.919999999999917 | 14.06 |
| 4.924999999999917 | 14.075 |
| 4.929999999999917 | 14.09 |
| 4.934999999999917 | 14.104 |
| 4.939999999999917 | 14.119 |
| 4.944999999999917 | 14.134 |
| 4.949999999999917 | 14.149 |
| 4.954999999999917 | 14.164 |
| 4.9599999999999165 | 14.179 |
| 4.964999999999916 | 14.194 |
| 4.969999999999916 | 14.209 |
| 4.974999999999916 | 14.224 |
| 4.979999999999916 | 14.239 |
| 4.984999999999916 | 14.254 |
| 4.989999999999916 | 14.269 |
| 4.994999999999916 | 14.284 |
| 4.999999999999916 | 14.298 |